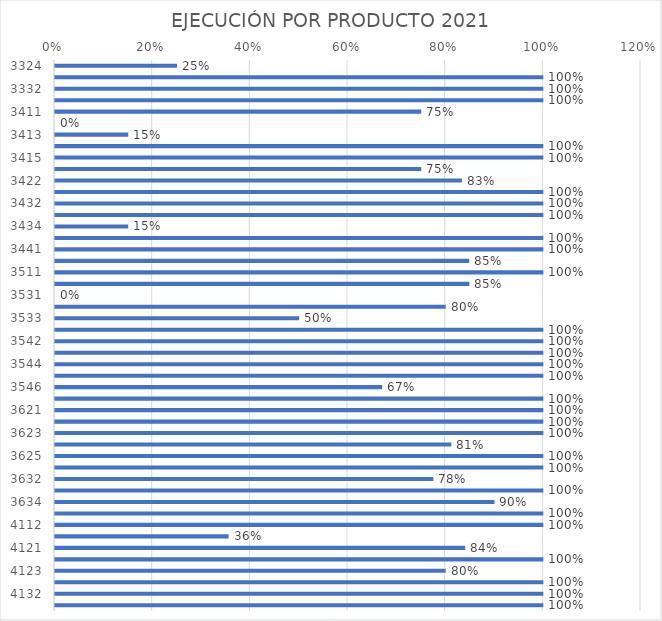
| Category | Series 0 |
|---|---|
| 3324.0 | 0.25 |
| 3331.0 | 1 |
| 3332.0 | 1 |
| 3333.0 | 1 |
| 3411.0 | 0.75 |
| 3412.0 | 0 |
| 3413.0 | 0.15 |
| 3414.0 | 1 |
| 3415.0 | 1 |
| 3421.0 | 0.75 |
| 3422.0 | 0.833 |
| 3431.0 | 1 |
| 3432.0 | 1 |
| 3433.0 | 1 |
| 3434.0 | 0.15 |
| 3435.0 | 1 |
| 3441.0 | 1 |
| 3442.0 | 0.848 |
| 3511.0 | 1 |
| 3521.0 | 0.848 |
| 3531.0 | 0 |
| 3532.0 | 0.8 |
| 3533.0 | 0.5 |
| 3541.0 | 1 |
| 3542.0 | 1 |
| 3543.0 | 1 |
| 3544.0 | 1 |
| 3545.0 | 1 |
| 3546.0 | 0.67 |
| 3611.0 | 1 |
| 3621.0 | 1 |
| 3622.0 | 1 |
| 3623.0 | 1 |
| 3624.0 | 0.812 |
| 3625.0 | 1 |
| 3631.0 | 1 |
| 3632.0 | 0.775 |
| 3633.0 | 1 |
| 3634.0 | 0.9 |
| 4111.0 | 1 |
| 4112.0 | 1 |
| 4113.0 | 0.356 |
| 4121.0 | 0.84 |
| 4122.0 | 1 |
| 4123.0 | 0.8 |
| 4131.0 | 1 |
| 4132.0 | 1 |
| 4211.0 | 1 |